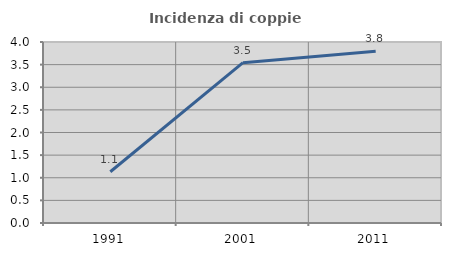
| Category | Incidenza di coppie miste |
|---|---|
| 1991.0 | 1.132 |
| 2001.0 | 3.543 |
| 2011.0 | 3.797 |